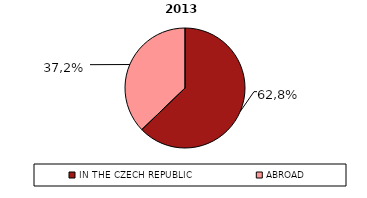
| Category | 2 013 |
|---|---|
| IN THE CZECH REPUBLIC | 62.8 |
| ABROAD | 37.2 |